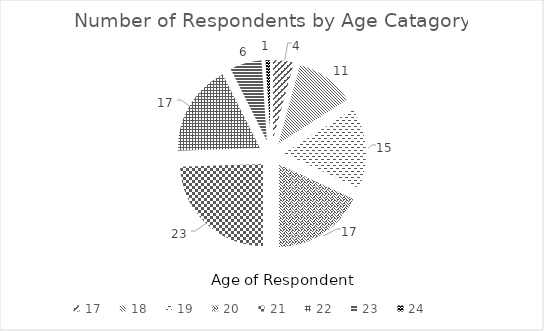
| Category | Frequency |
|---|---|
| 17.0 | 4 |
| 18.0 | 11 |
| 19.0 | 15 |
| 20.0 | 17 |
| 21.0 | 23 |
| 22.0 | 17 |
| 23.0 | 6 |
| 24.0 | 1 |